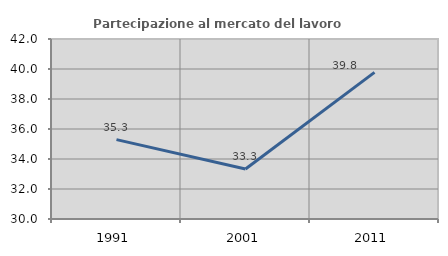
| Category | Partecipazione al mercato del lavoro  femminile |
|---|---|
| 1991.0 | 35.294 |
| 2001.0 | 33.333 |
| 2011.0 | 39.773 |